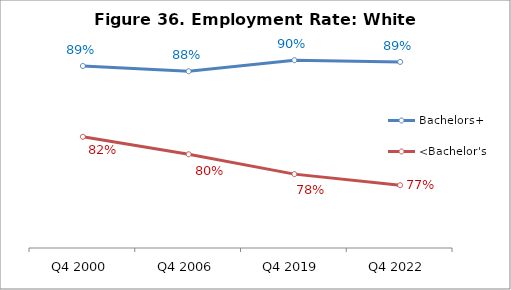
| Category | Bachelors+ | <Bachelor's |
|---|---|---|
| Q4 2000 | 0.89 | 0.816 |
| Q4 2006 | 0.884 | 0.798 |
| Q4 2019 | 0.896 | 0.777 |
| Q4 2022 | 0.894 | 0.765 |